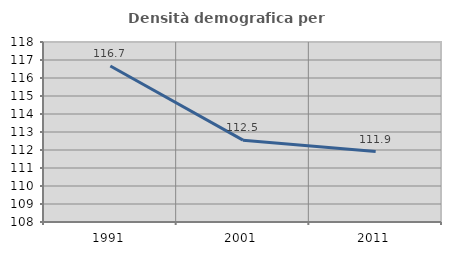
| Category | Densità demografica |
|---|---|
| 1991.0 | 116.667 |
| 2001.0 | 112.547 |
| 2011.0 | 111.913 |